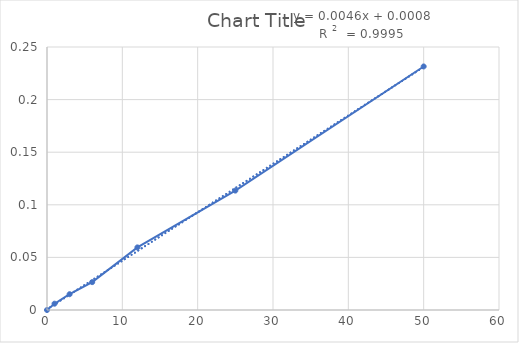
| Category | Series 0 |
|---|---|
| 0.0 | 0 |
| 1.0 | 0.006 |
| 3.0 | 0.015 |
| 6.0 | 0.027 |
| 12.0 | 0.06 |
| 25.0 | 0.113 |
| 50.0 | 0.231 |